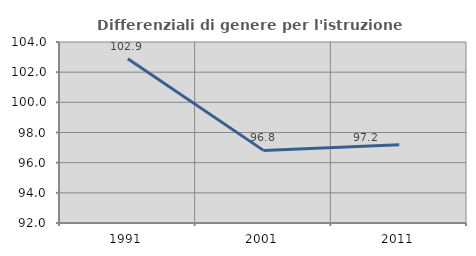
| Category | Differenziali di genere per l'istruzione superiore |
|---|---|
| 1991.0 | 102.884 |
| 2001.0 | 96.815 |
| 2011.0 | 97.188 |